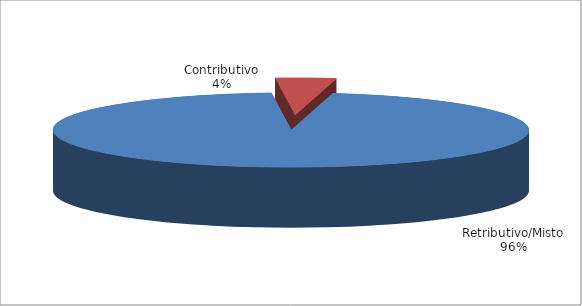
| Category | Series 1 |
|---|---|
| Retributivo/Misto | 7232 |
| Contributivo | 309 |